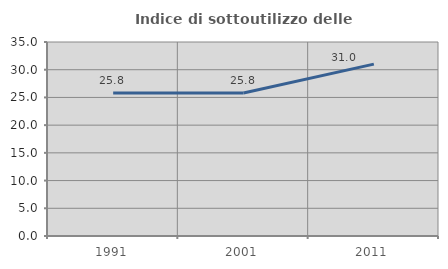
| Category | Indice di sottoutilizzo delle abitazioni  |
|---|---|
| 1991.0 | 25.797 |
| 2001.0 | 25.812 |
| 2011.0 | 31.006 |